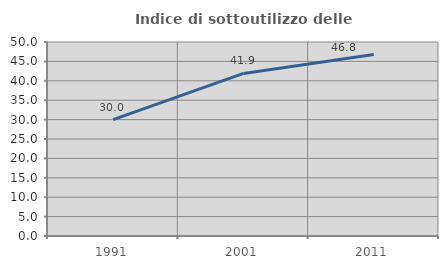
| Category | Indice di sottoutilizzo delle abitazioni  |
|---|---|
| 1991.0 | 30.015 |
| 2001.0 | 41.905 |
| 2011.0 | 46.79 |